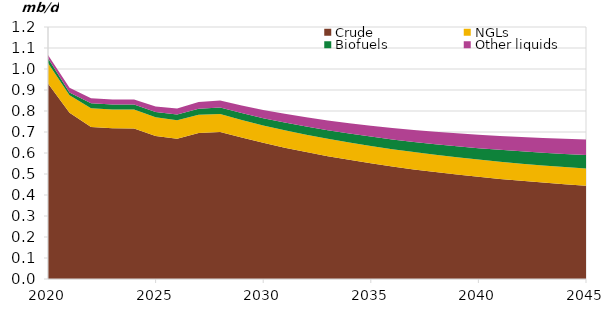
| Category | Crude | NGLs | Biofuels | Other liquids |
|---|---|---|---|---|
| 2020-01-01 | 0.931 | 0.098 | 0.023 | 0.015 |
| 2021-01-01 | 0.792 | 0.083 | 0.013 | 0.022 |
| 2022-01-01 | 0.724 | 0.09 | 0.023 | 0.024 |
| 2023-01-01 | 0.718 | 0.089 | 0.023 | 0.024 |
| 2024-01-01 | 0.717 | 0.09 | 0.024 | 0.024 |
| 2025-01-01 | 0.681 | 0.089 | 0.025 | 0.027 |
| 2026-01-01 | 0.668 | 0.088 | 0.027 | 0.029 |
| 2027-01-01 | 0.695 | 0.087 | 0.029 | 0.032 |
| 2028-01-01 | 0.7 | 0.086 | 0.031 | 0.034 |
| 2029-01-01 | 0.673 | 0.084 | 0.033 | 0.037 |
| 2030-01-01 | 0.648 | 0.083 | 0.035 | 0.039 |
| 2031-01-01 | 0.626 | 0.083 | 0.037 | 0.042 |
| 2032-01-01 | 0.604 | 0.083 | 0.039 | 0.044 |
| 2033-01-01 | 0.585 | 0.083 | 0.041 | 0.047 |
| 2034-01-01 | 0.567 | 0.083 | 0.043 | 0.049 |
| 2035-01-01 | 0.551 | 0.083 | 0.045 | 0.052 |
| 2036-01-01 | 0.536 | 0.082 | 0.047 | 0.054 |
| 2037-01-01 | 0.522 | 0.082 | 0.049 | 0.057 |
| 2038-01-01 | 0.509 | 0.082 | 0.051 | 0.059 |
| 2039-01-01 | 0.497 | 0.082 | 0.053 | 0.062 |
| 2040-01-01 | 0.487 | 0.082 | 0.055 | 0.064 |
| 2041-01-01 | 0.477 | 0.082 | 0.057 | 0.066 |
| 2042-01-01 | 0.468 | 0.082 | 0.059 | 0.068 |
| 2043-01-01 | 0.459 | 0.082 | 0.061 | 0.07 |
| 2044-01-01 | 0.451 | 0.081 | 0.063 | 0.072 |
| 2045-01-01 | 0.444 | 0.081 | 0.065 | 0.074 |